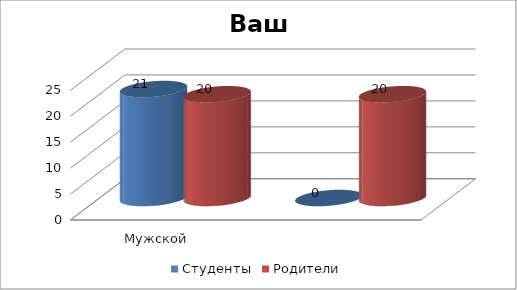
| Category | Студенты | Родители |
|---|---|---|
| Мужской | 21 | 20 |